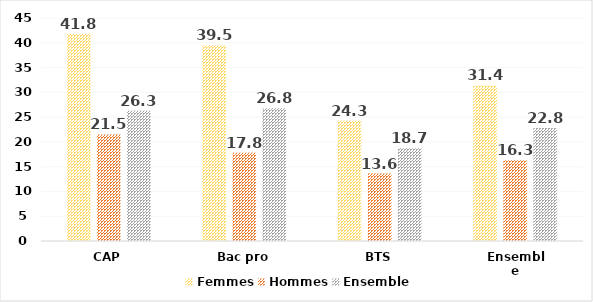
| Category | Femmes | Hommes | Ensemble |
|---|---|---|---|
| CAP | 41.8 | 21.5 | 26.3 |
| Bac pro | 39.5 | 17.8 | 26.8 |
| BTS | 24.3 | 13.6 | 18.7 |
| Ensemble | 31.4 | 16.3 | 22.8 |